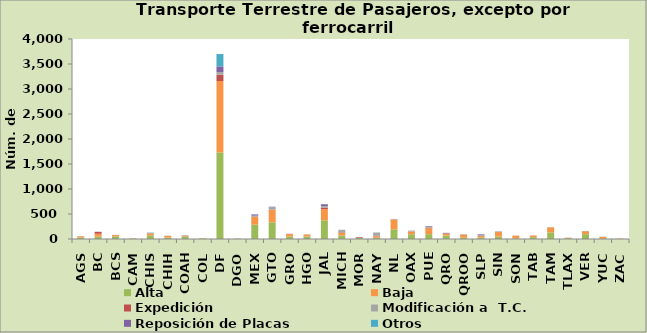
| Category | Alta                                         | Baja | Expedición | Modificación a  T.C. | Reposición de Placas | Otros |
|---|---|---|---|---|---|---|
| AGS | 30 | 24 | 0 | 2 | 1 | 0 |
| BC | 48 | 57 | 36 | 1 | 1 | 3 |
| BCS | 52 | 27 | 1 | 0 | 1 | 0 |
| CAM | 5 | 6 | 2 | 0 | 0 | 0 |
| CHIS | 74 | 37 | 3 | 5 | 3 | 6 |
| CHIH | 30 | 33 | 0 | 2 | 1 | 0 |
| COAH | 47 | 10 | 8 | 10 | 1 | 0 |
| COL | 9 | 7 | 0 | 0 | 0 | 0 |
| DF | 1730 | 1430 | 126 | 53 | 113 | 247 |
| DGO | 8 | 0 | 0 | 0 | 0 | 0 |
| MEX | 287 | 154 | 4 | 23 | 24 | 2 |
| GTO | 333 | 253 | 2 | 47 | 9 | 3 |
| GRO | 50 | 49 | 0 | 2 | 3 | 0 |
| HGO | 51 | 37 | 3 | 1 | 0 | 1 |
| JAL | 373 | 225 | 30 | 30 | 37 | 0 |
| MICH | 71 | 50 | 11 | 47 | 4 | 0 |
| MOR | 20 | 4 | 13 | 0 | 2 | 0 |
| NAY | 24 | 31 | 10 | 64 | 0 | 2 |
| NL | 194 | 192 | 4 | 9 | 2 | 0 |
| OAX | 95 | 54 | 3 | 15 | 1 | 0 |
| PUE | 97 | 118 | 14 | 12 | 13 | 4 |
| QRO | 70 | 36 | 6 | 1 | 10 | 0 |
| QROO | 26 | 58 | 5 | 5 | 1 | 0 |
| SLP | 31 | 31 | 1 | 13 | 17 | 0 |
| SIN | 47 | 92 | 3 | 2 | 6 | 0 |
| SON | 12 | 54 | 1 | 0 | 1 | 0 |
| TAB | 36 | 34 | 1 | 0 | 0 | 0 |
| TAM | 132 | 101 | 0 | 2 | 1 | 0 |
| TLAX | 17 | 10 | 0 | 0 | 0 | 0 |
| VER | 97 | 58 | 0 | 2 | 2 | 0 |
| YUC | 7 | 36 | 0 | 0 | 0 | 3 |
| ZAC | 1 | 7 | 0 | 0 | 0 | 0 |